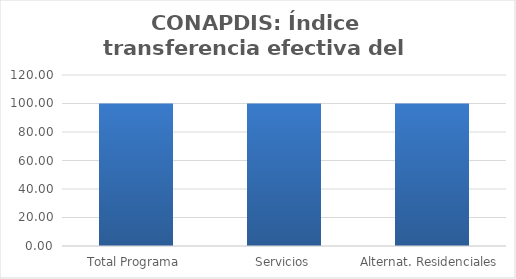
| Category | Índice transferencia efectiva del gasto (ITG) |
|---|---|
| Total Programa | 100 |
| Servicios | 100 |
| Alternat. Residenciales | 100 |